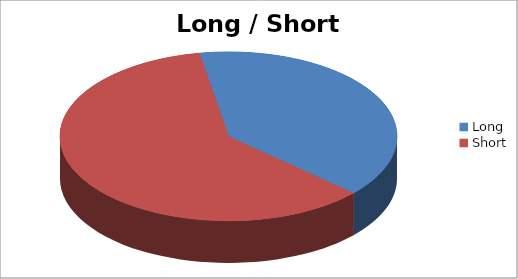
| Category | Long / Short Entries |
|---|---|
| Long | 15 |
| Short | 23 |